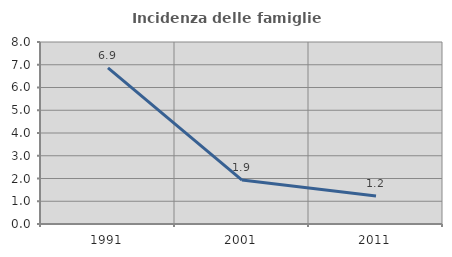
| Category | Incidenza delle famiglie numerose |
|---|---|
| 1991.0 | 6.863 |
| 2001.0 | 1.932 |
| 2011.0 | 1.23 |